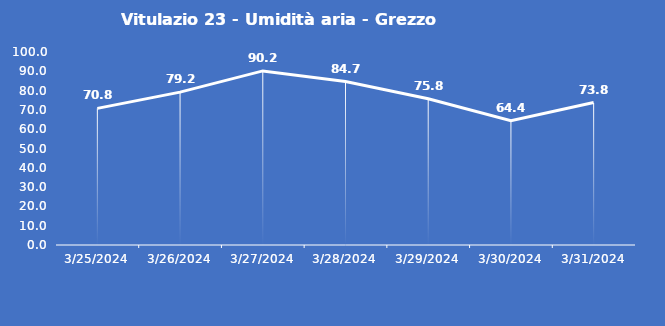
| Category | Vitulazio 23 - Umidità aria - Grezzo (%) |
|---|---|
| 3/25/24 | 70.8 |
| 3/26/24 | 79.2 |
| 3/27/24 | 90.2 |
| 3/28/24 | 84.7 |
| 3/29/24 | 75.8 |
| 3/30/24 | 64.4 |
| 3/31/24 | 73.8 |